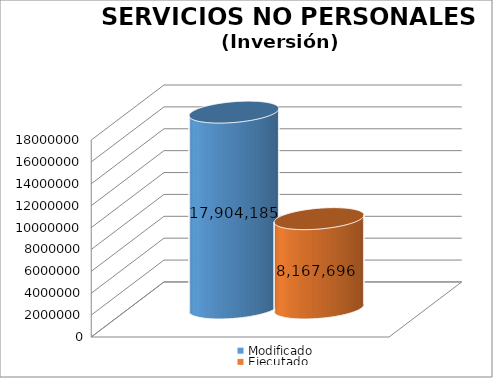
| Category | Modificado | Ejecutado |
|---|---|---|
| 0 | 17904185 | 8167695.59 |